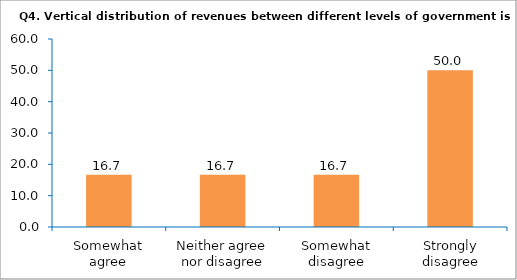
| Category | Series 0 |
|---|---|
| Somewhat agree | 16.667 |
| Neither agree nor disagree | 16.667 |
| Somewhat disagree | 16.667 |
| Strongly disagree | 50 |